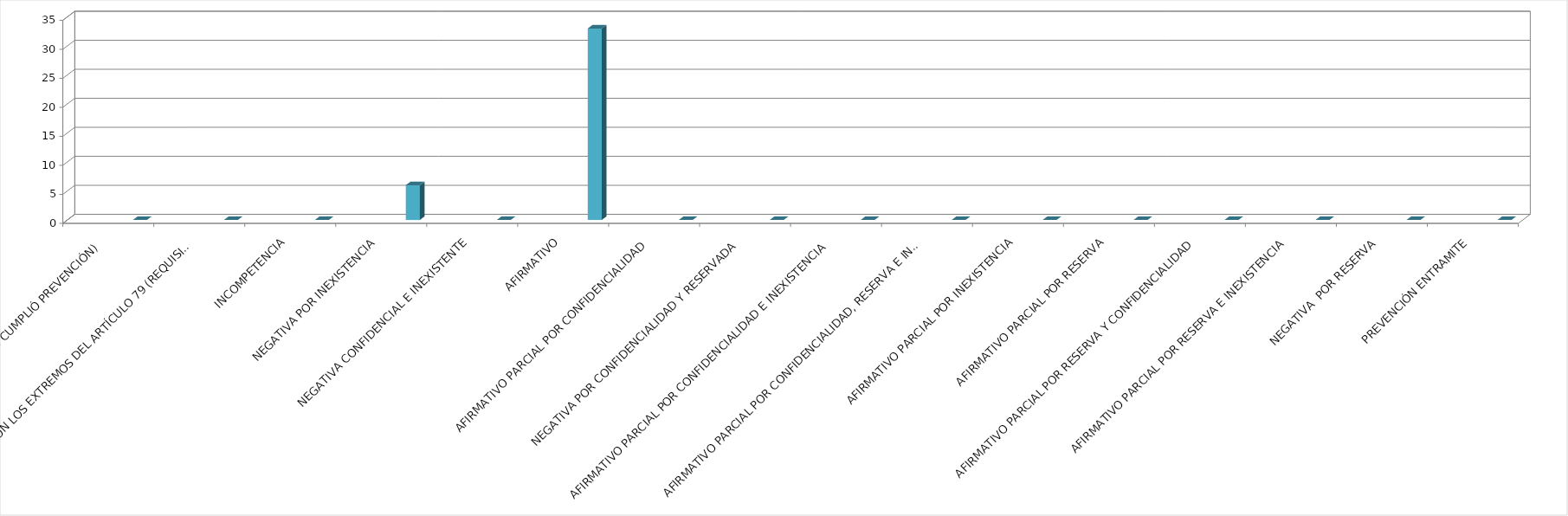
| Category | Series 0 | Series 1 | Series 2 | Series 3 | Series 4 |
|---|---|---|---|---|---|
| SE TIENE POR NO PRESENTADA ( NO CUMPLIÓ PREVENCIÓN) |  |  |  |  | 0 |
| NO CUMPLIO CON LOS EXTREMOS DEL ARTÍCULO 79 (REQUISITOS) |  |  |  |  | 0 |
| INCOMPETENCIA |  |  |  |  | 0 |
| NEGATIVA POR INEXISTENCIA |  |  |  |  | 6 |
| NEGATIVA CONFIDENCIAL E INEXISTENTE |  |  |  |  | 0 |
| AFIRMATIVO |  |  |  |  | 33 |
| AFIRMATIVO PARCIAL POR CONFIDENCIALIDAD |  |  |  |  | 0 |
| NEGATIVA POR CONFIDENCIALIDAD Y RESERVADA |  |  |  |  | 0 |
| AFIRMATIVO PARCIAL POR CONFIDENCIALIDAD E INEXISTENCIA |  |  |  |  | 0 |
| AFIRMATIVO PARCIAL POR CONFIDENCIALIDAD, RESERVA E INEXISTENCIA |  |  |  |  | 0 |
| AFIRMATIVO PARCIAL POR INEXISTENCIA |  |  |  |  | 0 |
| AFIRMATIVO PARCIAL POR RESERVA |  |  |  |  | 0 |
| AFIRMATIVO PARCIAL POR RESERVA Y CONFIDENCIALIDAD |  |  |  |  | 0 |
| AFIRMATIVO PARCIAL POR RESERVA E INEXISTENCIA |  |  |  |  | 0 |
| NEGATIVA  POR RESERVA |  |  |  |  | 0 |
| PREVENCIÓN ENTRAMITE |  |  |  |  | 0 |